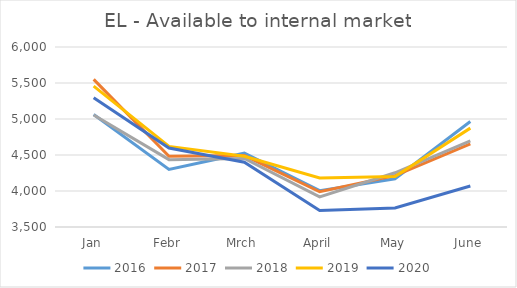
| Category | 2016 | 2017 | 2018 | 2019 | 2020 |
|---|---|---|---|---|---|
| Jan | 5063 | 5550.875 | 5054.573 | 5455.562 | 5294.38 |
| Febr | 4300 | 4481.545 | 4435.298 | 4619.251 | 4597.341 |
| Mrch | 4525 | 4492.349 | 4452.799 | 4482.228 | 4398.722 |
| April | 4005 | 3989.165 | 3917.683 | 4180.444 | 3730.475 |
| May | 4170 | 4212.741 | 4252.817 | 4202.394 | 3764.832 |
| June | 4966 | 4653.002 | 4695.877 | 4873.119 | 4068.906 |